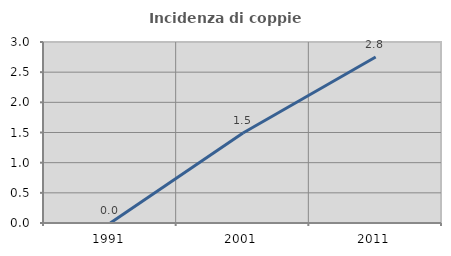
| Category | Incidenza di coppie miste |
|---|---|
| 1991.0 | 0 |
| 2001.0 | 1.493 |
| 2011.0 | 2.752 |